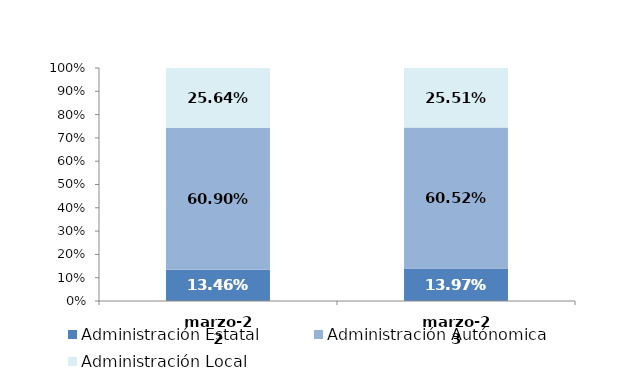
| Category | Administración Estatal | Administración Autónomica | Administración Local |
|---|---|---|---|
| 2022-03-01 | 0.135 | 0.609 | 0.256 |
| 2023-03-01 | 0.14 | 0.605 | 0.255 |